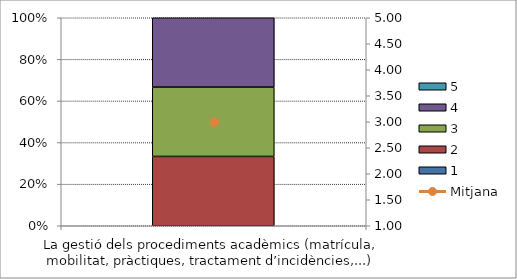
| Category | 1 | 2 | 3 | 4 | 5 |
|---|---|---|---|---|---|
| La gestió dels procediments acadèmics (matrícula, mobilitat, pràctiques, tractament d’incidències,...) | 0 | 1 | 1 | 1 | 0 |